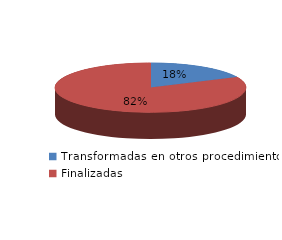
| Category | Series 0 |
|---|---|
| Transformadas en otros procedimientos | 2425 |
| Finalizadas | 11081 |